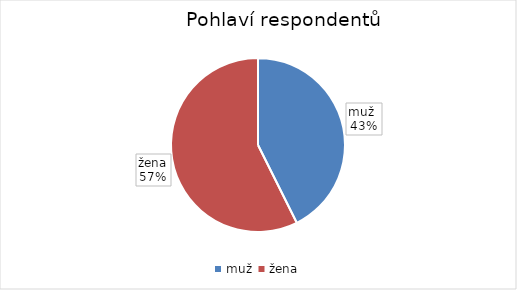
| Category | Series 0 |
|---|---|
| muž  | 84 |
| žena | 113 |